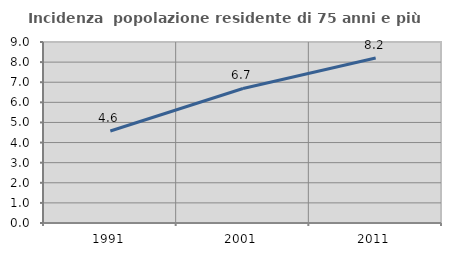
| Category | Incidenza  popolazione residente di 75 anni e più |
|---|---|
| 1991.0 | 4.576 |
| 2001.0 | 6.69 |
| 2011.0 | 8.205 |